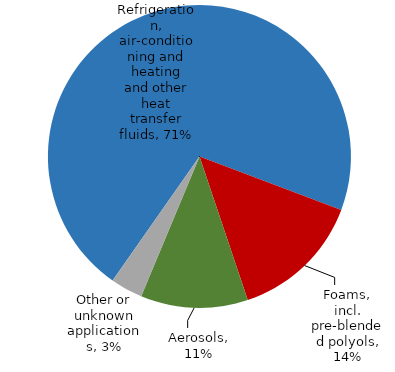
| Category | Tonnes |
|---|---|
| Refrigeration, air-conditioning and heating and other heat transfer fluids | 0.71 |
| Foams, incl. pre-blended polyols | 0.141 |
| Aerosols | 0.114 |
| Other or unknown applications | 0.034 |